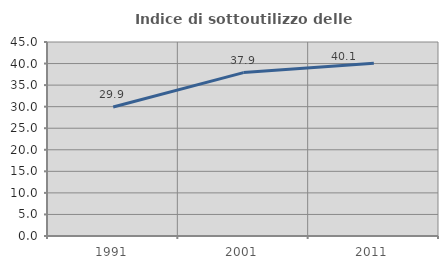
| Category | Indice di sottoutilizzo delle abitazioni  |
|---|---|
| 1991.0 | 29.911 |
| 2001.0 | 37.9 |
| 2011.0 | 40.076 |